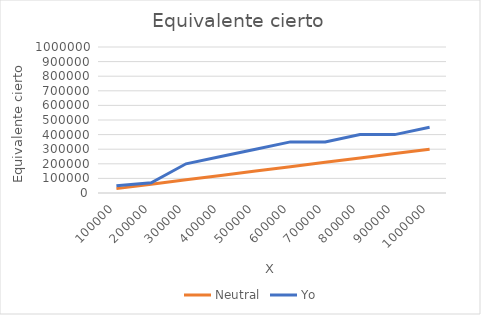
| Category | Neutral | Yo |
|---|---|---|
| 100000.0 | 30000 | 50000 |
| 200000.0 | 60000 | 70000 |
| 300000.0 | 90000 | 200000 |
| 400000.0 | 120000 | 250000 |
| 500000.0 | 150000 | 300000 |
| 600000.0 | 180000 | 350000 |
| 700000.0 | 210000 | 350000 |
| 800000.0 | 240000 | 400000 |
| 900000.0 | 270000 | 400000 |
| 1000000.0 | 300000 | 450000 |